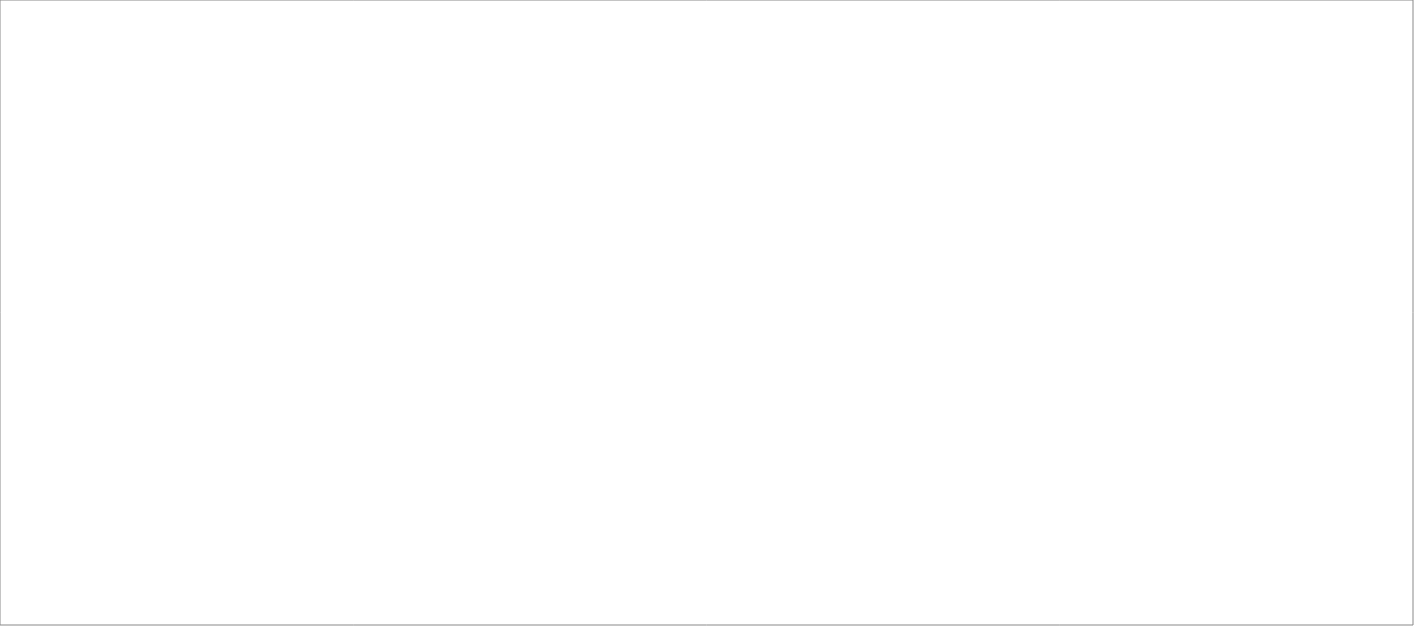
| Category | Total |
|---|---|
| Poolia Sverige AB | 85 |
| Randstad AB | 78.04 |
| Wise Professionals AB | 65 |
| Tarasso AB | 65 |
| Experis AB | 60.71 |